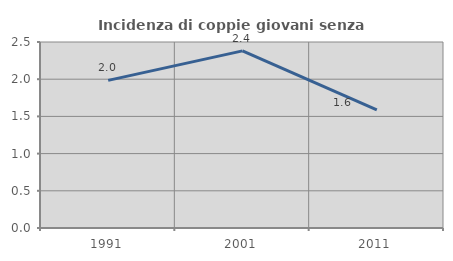
| Category | Incidenza di coppie giovani senza figli |
|---|---|
| 1991.0 | 1.984 |
| 2001.0 | 2.381 |
| 2011.0 | 1.587 |